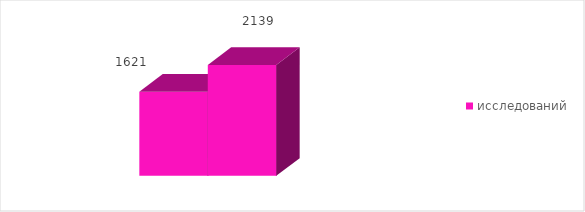
| Category | исследований |
|---|---|
| 0 | 2139 |